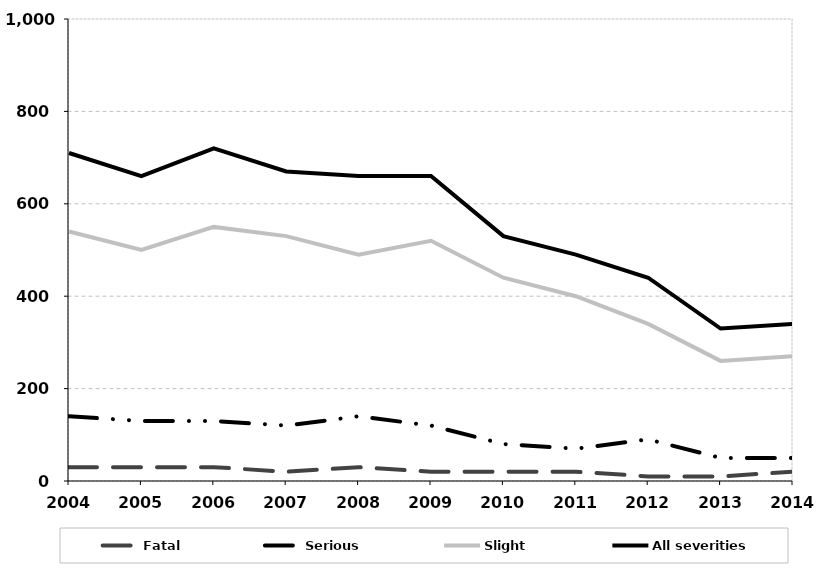
| Category | Fatal | Serious | Slight | All severities |
|---|---|---|---|---|
| 2004.0 | 30 | 140 | 540 | 710 |
| 2005.0 | 30 | 130 | 500 | 660 |
| 2006.0 | 30 | 130 | 550 | 720 |
| 2007.0 | 20 | 120 | 530 | 670 |
| 2008.0 | 30 | 140 | 490 | 660 |
| 2009.0 | 20 | 120 | 520 | 660 |
| 2010.0 | 20 | 80 | 440 | 530 |
| 2011.0 | 20 | 70 | 400 | 490 |
| 2012.0 | 10 | 90 | 340 | 440 |
| 2013.0 | 10 | 50 | 260 | 330 |
| 2014.0 | 20 | 50 | 270 | 340 |